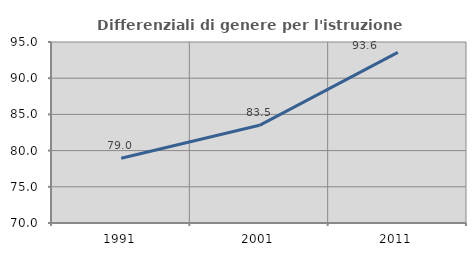
| Category | Differenziali di genere per l'istruzione superiore |
|---|---|
| 1991.0 | 78.953 |
| 2001.0 | 83.491 |
| 2011.0 | 93.577 |